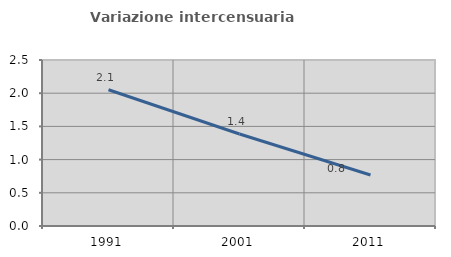
| Category | Variazione intercensuaria annua |
|---|---|
| 1991.0 | 2.052 |
| 2001.0 | 1.386 |
| 2011.0 | 0.768 |